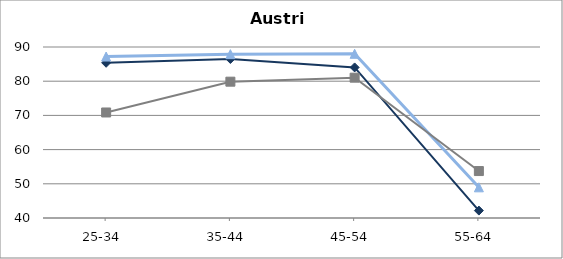
| Category | Work-study programmes | School-based programmes | General programmes |
|---|---|---|---|
| 25-34  | 85.381 | 87.209 | 70.854 |
| 35-44  | 86.493 | 87.911 | 79.859 |
| 45-54  | 84.027 | 88.012 | 81.03 |
| 55-64  | 42.166 | 48.966 | 53.726 |